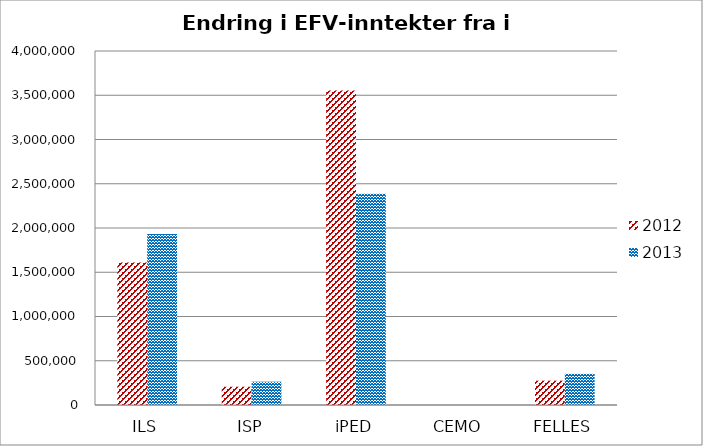
| Category | 2012 | 2013 |
|---|---|---|
| ILS | 1609533 | 1932824.512 |
| ISP | 206057 | 263558.568 |
| iPED | 3552714 | 2387867.92 |
| CEMO | 0 | 0 |
| FELLES | 274826 | 352248.736 |